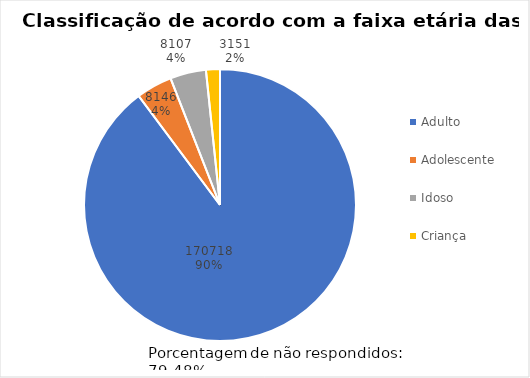
| Category | Series 0 |
|---|---|
| Adulto | 170718 |
| Adolescente | 8146 |
| Idoso | 8107 |
| Criança | 3151 |